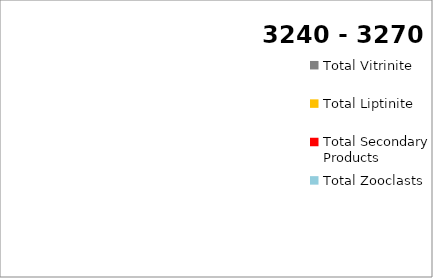
| Category | Series 2 |
|---|---|
| Total Vitrinite | 0 |
| Total Liptinite | 0 |
| Total  Inertinite | 0 |
| Total Secondary Products | 0 |
| Total Zooclasts | 0 |